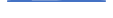
| Category | Series 0 |
|---|---|
| 0 | 17 |
| 1 | 25 |
| 2 | 18 |
| 3 | 17 |
| 4 | 15 |
| 5 | 25 |
| 6 | 22 |
| 7 | 25 |
| 8 | 16 |